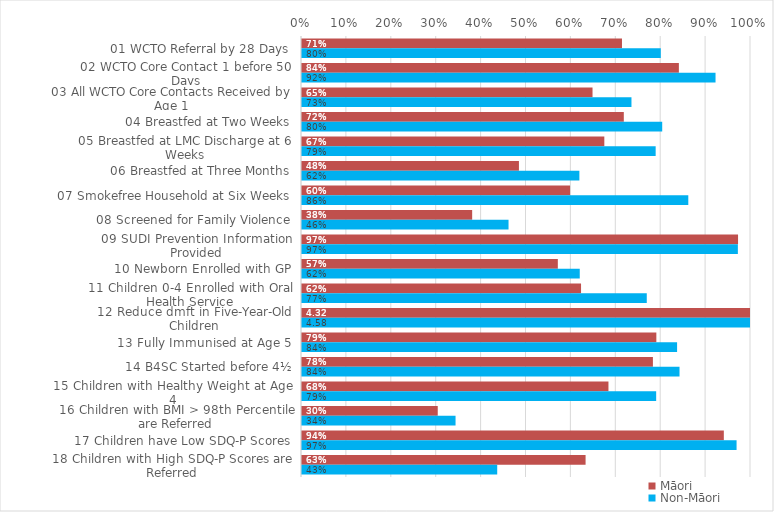
| Category | Māori | Non-Māori |
|---|---|---|
| 01 WCTO Referral by 28 Days | 0.713 | 0.799 |
| 02 WCTO Core Contact 1 before 50 Days | 0.839 | 0.921 |
| 03 All WCTO Core Contacts Received by Age 1 | 0.647 | 0.734 |
| 04 Breastfed at Two Weeks | 0.717 | 0.802 |
| 05 Breastfed at LMC Discharge at 6 Weeks | 0.673 | 0.788 |
| 06 Breastfed at Three Months | 0.483 | 0.618 |
| 07 Smokefree Household at Six Weeks | 0.597 | 0.86 |
| 08 Screened for Family Violence | 0.379 | 0.46 |
| 09 SUDI Prevention Information Provided | 0.971 | 0.971 |
| 10 Newborn Enrolled with GP | 0.57 | 0.619 |
| 11 Children 0-4 Enrolled with Oral Health Service | 0.621 | 0.768 |
| 12 Reduce dmft in Five-Year-Old Children | 4.319 | 4.579 |
| 13 Fully Immunised at Age 5 | 0.789 | 0.835 |
| 14 B4SC Started before 4½ | 0.782 | 0.841 |
| 15 Children with Healthy Weight at Age 4 | 0.683 | 0.789 |
| 16 Children with BMI > 98th Percentile are Referred | 0.302 | 0.342 |
| 17 Children have Low SDQ-P Scores | 0.939 | 0.968 |
| 18 Children with High SDQ-P Scores are Referred | 0.632 | 0.435 |